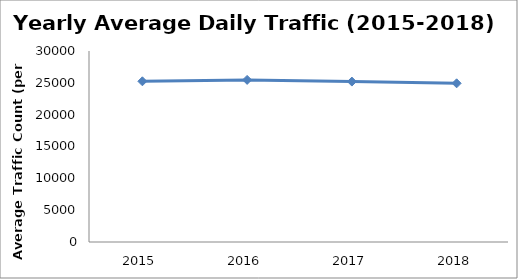
| Category | Series 0 |
|---|---|
| 2015.0 | 25240.784 |
| 2016.0 | 25462.762 |
| 2017.0 | 25195.616 |
| 2018.0 | 24924.205 |